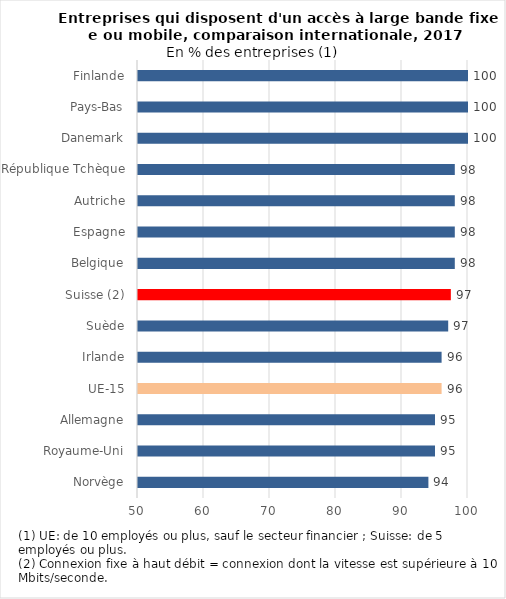
| Category | Series 0 |
|---|---|
| Norvège | 94 |
| Royaume-Uni | 95 |
| Allemagne | 95 |
| UE-15 | 96 |
| Irlande | 96 |
| Suède | 97 |
| Suisse (2) | 97.4 |
| Belgique | 98 |
| Espagne | 98 |
| Autriche | 98 |
| République Tchèque | 98 |
| Danemark | 100 |
| Pays-Bas | 100 |
| Finlande | 100 |